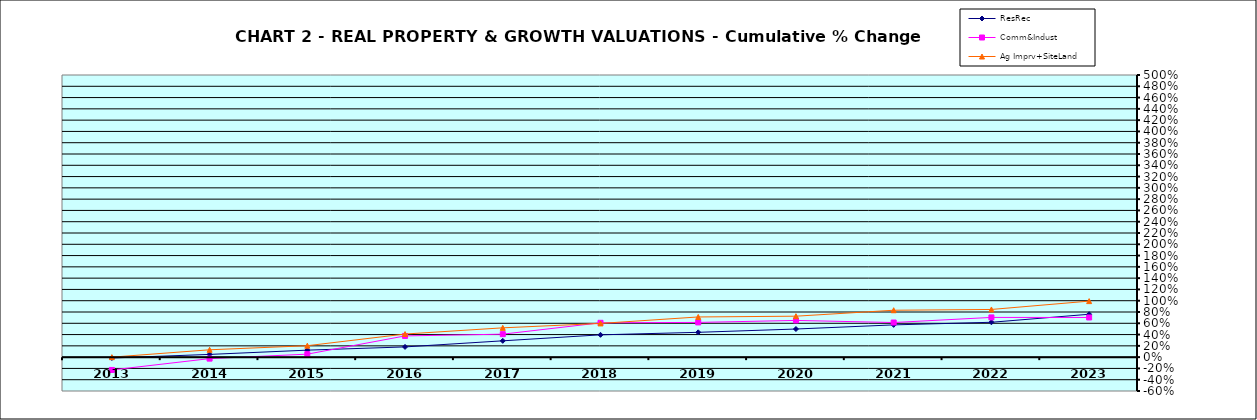
| Category | ResRec | Comm&Indust | Ag Imprv+SiteLand |
|---|---|---|---|
| 2013.0 | -0.015 | -0.227 | 0 |
| 2014.0 | 0.048 | -0.026 | 0.13 |
| 2015.0 | 0.124 | 0.053 | 0.203 |
| 2016.0 | 0.181 | 0.376 | 0.409 |
| 2017.0 | 0.289 | 0.407 | 0.519 |
| 2018.0 | 0.395 | 0.608 | 0.598 |
| 2019.0 | 0.44 | 0.615 | 0.712 |
| 2020.0 | 0.498 | 0.651 | 0.726 |
| 2021.0 | 0.572 | 0.614 | 0.831 |
| 2022.0 | 0.618 | 0.704 | 0.845 |
| 2023.0 | 0.76 | 0.703 | 0.993 |